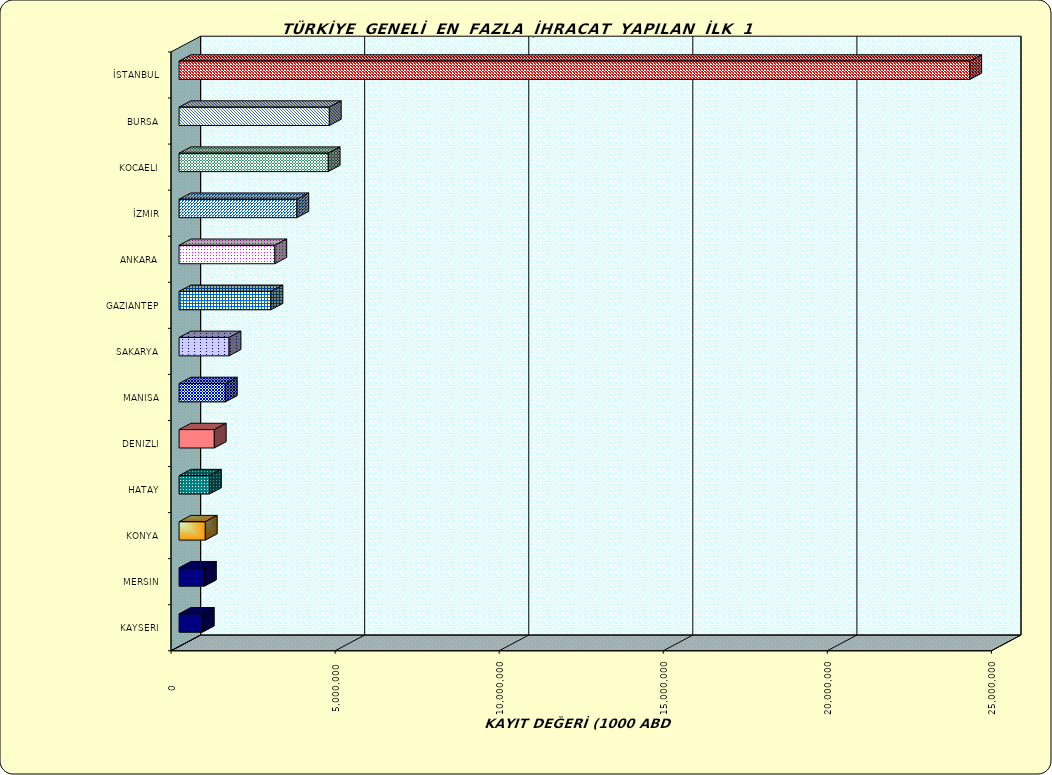
| Category | Series 0 |
|---|---|
| İSTANBUL | 24096055.159 |
| BURSA | 4579220.627 |
| KOCAELI | 4545912.732 |
| İZMIR | 3591074.05 |
| ANKARA | 2918744.935 |
| GAZIANTEP | 2801382.707 |
| SAKARYA | 1523226.069 |
| MANISA | 1410868.528 |
| DENIZLI | 1073805.106 |
| HATAY | 926868.045 |
| KONYA | 800163.637 |
| MERSIN | 775020.95 |
| KAYSERI | 710064.417 |